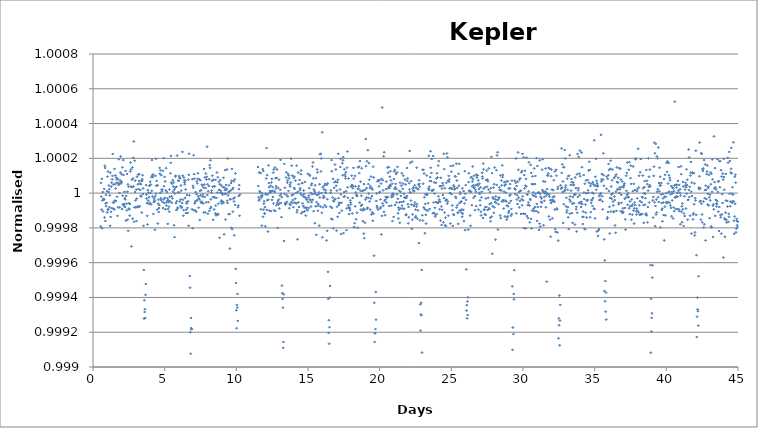
| Category | Series 0 |
|---|---|
| 0.5383740002289414 | 1 |
| 0.5588090000674129 | 1 |
| 0.5792430001311004 | 1 |
| 0.5996779999695718 | 1 |
| 0.6201120000332594 | 1 |
| 0.640546000096947 | 1 |
| 0.6609809999354184 | 1 |
| 0.6814149999991059 | 1 |
| 0.7018499998375773 | 1 |
| 0.7222839999012649 | 1 |
| 0.7427190002053976 | 1 |
| 0.7631529998034239 | 1 |
| 0.7835880001075566 | 1 |
| 0.8040220001712441 | 1 |
| 0.8244559997692704 | 1 |
| 0.8448910000734031 | 1 |
| 0.8653250001370907 | 1 |
| 0.8857599999755621 | 1 |
| 0.9061940000392497 | 1 |
| 0.9266289998777211 | 1 |
| 0.9470629999414086 | 1 |
| 0.9674970000050962 | 1 |
| 0.9879319998435676 | 1 |
| 1.0083659999072552 | 1 |
| 1.0288010002113879 | 1 |
| 1.0492349998094141 | 1 |
| 1.0696700001135468 | 1 |
| 1.0901040001772344 | 1 |
| 1.1105390000157058 | 1 |
| 1.1309730000793934 | 1 |
| 1.151407000143081 | 1 |
| 1.1718419999815524 | 1 |
| 1.19227600004524 | 1 |
| 1.2127109998837113 | 1 |
| 1.233144999947399 | 1 |
| 1.2535799997858703 | 1 |
| 1.2740139998495579 | 1 |
| 1.2944479999132454 | 1 |
| 1.3148830002173781 | 1 |
| 1.3353169998154044 | 1 |
| 1.3557520001195371 | 1 |
| 1.3761860001832247 | 1 |
| 1.396621000021696 | 1 |
| 1.4170550000853837 | 1 |
| 1.4374890001490712 | 1 |
| 1.4579239999875426 | 1 |
| 1.4783580000512302 | 1 |
| 1.4987929998897016 | 1 |
| 1.5192269999533892 | 1 |
| 1.5396610000170767 | 1 |
| 1.5600959998555481 | 1 |
| 1.5805299999192357 | 1 |
| 1.6009650002233684 | 1 |
| 1.6214000000618398 | 1 |
| 1.6418340001255274 | 1 |
| 1.662268000189215 | 1 |
| 1.6827030000276864 | 1 |
| 1.703137000091374 | 1 |
| 1.7235719999298453 | 1 |
| 1.744005999993533 | 1 |
| 1.7644409998320043 | 1 |
| 1.7848749998956919 | 1 |
| 1.8053089999593794 | 1 |
| 1.8257439997978508 | 1 |
| 1.8461779998615384 | 1 |
| 1.866613000165671 | 1 |
| 1.8870470002293587 | 1 |
| 1.90748200006783 | 1 |
| 1.9279160001315176 | 1 |
| 1.9483500001952052 | 1 |
| 1.9687850000336766 | 1 |
| 1.9892190000973642 | 1 |
| 2.0096539999358356 | 1 |
| 2.030088999774307 | 1 |
| 2.0505220000632107 | 1 |
| 2.070956999901682 | 1 |
| 2.0913909999653697 | 1 |
| 2.111825999803841 | 1 |
| 2.132261000107974 | 1 |
| 2.1526950001716614 | 1 |
| 2.1731289997696877 | 1 |
| 2.193562999833375 | 1 |
| 2.213998000137508 | 1 |
| 2.2344329999759793 | 1 |
| 2.254867000039667 | 1 |
| 2.2753019998781383 | 1 |
| 2.295735000167042 | 1 |
| 2.3161700000055134 | 1 |
| 2.336604000069201 | 1 |
| 2.3570389999076724 | 1 |
| 2.377474000211805 | 1 |
| 2.3979079998098314 | 1 |
| 2.418341999873519 | 1 |
| 2.4387759999372065 | 1 |
| 2.459210999775678 | 1 |
| 2.4796460000798106 | 1 |
| 2.500080000143498 | 1 |
| 2.5205149999819696 | 1 |
| 2.540949000045657 | 1 |
| 2.5613830001093447 | 1 |
| 2.581817999947816 | 1 |
| 2.6022520000115037 | 1 |
| 2.622686999849975 | 1 |
| 2.643122000154108 | 1 |
| 2.6635560002177954 | 1 |
| 2.6839899998158216 | 1 |
| 2.704423999879509 | 1 |
| 2.724859000183642 | 1 |
| 2.7452940000221133 | 1 |
| 2.765728000085801 | 1 |
| 2.7861629999242723 | 1 |
| 2.806596000213176 | 1 |
| 2.8270310000516474 | 1 |
| 2.847465000115335 | 1 |
| 2.8678999999538064 | 1 |
| 2.888334999792278 | 1 |
| 2.9087689998559654 | 1 |
| 2.929202999919653 | 1 |
| 2.9496369999833405 | 1 |
| 2.970071999821812 | 1 |
| 2.9905070001259446 | 1 |
| 3.010941000189632 | 1 |
| 3.0313760000281036 | 1 |
| 3.051810000091791 | 1 |
| 3.0722440001554787 | 1 |
| 3.09267899999395 | 1 |
| 3.1131130000576377 | 1 |
| 3.133547999896109 | 1 |
| 3.1539819999597967 | 1 |
| 3.1744160000234842 | 1 |
| 3.1948509998619556 | 1 |
| 3.215284999925643 | 1 |
| 3.235720000229776 | 1 |
| 3.2561550000682473 | 1 |
| 3.276589000131935 | 1 |
| 3.2970239999704063 | 1 |
| 3.3174569997936487 | 1 |
| 3.3378920000977814 | 1 |
| 3.358326000161469 | 1 |
| 3.3787609999999404 | 1 |
| 3.399195999838412 | 1 |
| 3.4196299999020994 | 1 |
| 3.440063999965787 | 1 |
| 3.4604980000294745 | 1 |
| 3.480932999867946 | 1 |
| 3.5013680001720786 | 1 |
| 3.521801999770105 | 1 |
| 3.5422370000742376 | 1 |
| 3.56266999989748 | 0.999 |
| 3.5831050002016127 | 0.999 |
| 3.603540000040084 | 0.999 |
| 3.6239740001037717 | 0.999 |
| 3.644408999942243 | 0.999 |
| 3.6648430000059307 | 0.999 |
| 3.6852770000696182 | 0.999 |
| 3.7057119999080896 | 1 |
| 3.726145999971777 | 1 |
| 3.7465809998102486 | 1 |
| 3.767014999873936 | 1 |
| 3.787450000178069 | 1 |
| 3.807883999776095 | 1 |
| 3.8283179998397827 | 1 |
| 3.8487530001439154 | 1 |
| 3.869187000207603 | 1 |
| 3.8896220000460744 | 1 |
| 3.910056999884546 | 1 |
| 3.9304900001734495 | 1 |
| 3.950925000011921 | 1 |
| 3.9713590000756085 | 1 |
| 3.99179399991408 | 1 |
| 4.0122279999777675 | 1 |
| 4.032662999816239 | 1 |
| 4.053098000120372 | 1 |
| 4.073530999943614 | 1 |
| 4.093965999782085 | 1 |
| 4.114401000086218 | 1 |
| 4.134835000149906 | 1 |
| 4.155269999988377 | 1 |
| 4.175704000052065 | 1 |
| 4.196138000115752 | 1 |
| 4.21657200017944 | 1 |
| 4.237007000017911 | 1 |
| 4.257441999856383 | 1 |
| 4.27787599992007 | 1 |
| 4.298311000224203 | 1 |
| 4.318744999822229 | 1 |
| 4.339178999885917 | 1 |
| 4.359614000190049 | 1 |
| 4.380047999788076 | 1 |
| 4.400483000092208 | 1 |
| 4.42091799993068 | 1 |
| 4.4413510002195835 | 1 |
| 4.461786000058055 | 1 |
| 4.4822200001217425 | 1 |
| 4.502654999960214 | 1 |
| 4.5230890000239015 | 1 |
| 4.543523999862373 | 1 |
| 4.56395799992606 | 1 |
| 4.584391999989748 | 1 |
| 4.604826999828219 | 1 |
| 4.625262000132352 | 1 |
| 4.64569600019604 | 1 |
| 4.666129999794066 | 1 |
| 4.6865639998577535 | 1 |
| 4.706999000161886 | 1 |
| 4.727434000000358 | 1 |
| 4.747868000064045 | 1 |
| 4.768302999902517 | 1 |
| 4.788736999966204 | 1 |
| 4.809171999804676 | 1 |
| 4.829605999868363 | 1 |
| 4.850039999932051 | 1 |
| 4.870474999770522 | 1 |
| 4.89090899983421 | 1 |
| 4.911344000138342 | 1 |
| 4.93177800020203 | 1 |
| 4.952211999800056 | 1 |
| 4.972647000104189 | 1 |
| 4.9930810001678765 | 1 |
| 5.013516000006348 | 1 |
| 5.0339500000700355 | 1 |
| 5.054384999908507 | 1 |
| 5.074818999972194 | 1 |
| 5.095253000035882 | 1 |
| 5.115687999874353 | 1 |
| 5.136121999938041 | 1 |
| 5.156556999776512 | 1 |
| 5.1769909998402 | 1 |
| 5.1974249999038875 | 1 |
| 5.21786000020802 | 1 |
| 5.238295000046492 | 1 |
| 5.258729000110179 | 1 |
| 5.279163000173867 | 1 |
| 5.299598000012338 | 1 |
| 5.320032000076026 | 1 |
| 5.340466999914497 | 1 |
| 5.360900999978185 | 1 |
| 5.381335000041872 | 1 |
| 5.401769999880344 | 1 |
| 5.422205000184476 | 1 |
| 5.442638000007719 | 1 |
| 5.46307299984619 | 1 |
| 5.483508000150323 | 1 |
| 5.5039420002140105 | 1 |
| 5.524377000052482 | 1 |
| 5.5448110001161695 | 1 |
| 5.565245000179857 | 1 |
| 5.585680000018328 | 1 |
| 5.606114000082016 | 1 |
| 5.6265480001457036 | 1 |
| 5.646982999984175 | 1 |
| 5.667417999822646 | 1 |
| 5.687853000126779 | 1 |
| 5.7082859999500215 | 1 |
| 5.728720999788493 | 1 |
| 5.7491549998521805 | 1 |
| 5.769590000156313 | 1 |
| 5.790024000220001 | 1 |
| 5.810459000058472 | 1 |
| 5.83089300012216 | 1 |
| 5.851327000185847 | 1 |
| 5.871762000024319 | 1 |
| 5.892196000088006 | 1 |
| 5.912630999926478 | 1 |
| 5.93306600023061 | 1 |
| 5.953499000053853 | 1 |
| 5.973933999892324 | 1 |
| 5.994367999956012 | 1 |
| 6.014802999794483 | 1 |
| 6.035238000098616 | 1 |
| 6.0556720001623034 | 1 |
| 6.076106000225991 | 1 |
| 6.096541000064462 | 1 |
| 6.11697500012815 | 1 |
| 6.137409999966621 | 1 |
| 6.157844000030309 | 1 |
| 6.17827899986878 | 1 |
| 6.198712999932468 | 1 |
| 6.2191469999961555 | 1 |
| 6.239581999834627 | 1 |
| 6.2600159998983145 | 1 |
| 6.280451000202447 | 1 |
| 6.3008849998004735 | 1 |
| 6.321318999864161 | 1 |
| 6.341754000168294 | 1 |
| 6.362188000231981 | 1 |
| 6.382623000070453 | 1 |
| 6.40305700013414 | 1 |
| 6.423491999972612 | 1 |
| 6.443926999811083 | 1 |
| 6.464360000099987 | 1 |
| 6.484794999938458 | 1 |
| 6.505229000002146 | 1 |
| 6.525663999840617 | 1 |
| 6.546097999904305 | 1 |
| 6.566533000208437 | 1 |
| 6.586966999806464 | 1 |
| 6.607402000110596 | 1 |
| 6.627836000174284 | 1 |
| 6.64826999977231 | 1 |
| 6.668705000076443 | 1 |
| 6.689139999914914 | 1 |
| 6.709573999978602 | 1 |
| 6.7300080000422895 | 1 |
| 6.750442000105977 | 1 |
| 6.7708769999444485 | 0.999 |
| 6.79131199978292 | 0.999 |
| 6.8117459998466074 | 0.999 |
| 6.832179999910295 | 0.999 |
| 6.852615000214428 | 0.999 |
| 6.873048999812454 | 0.999 |
| 6.893484000116587 | 0.999 |
| 6.913918000180274 | 1 |
| 6.934353000018746 | 1 |
| 6.954787000082433 | 1 |
| 6.975221000146121 | 1 |
| 6.995655999984592 | 1 |
| 7.01609000004828 | 1 |
| 7.036524999886751 | 1 |
| 7.056960000190884 | 1 |
| 7.077393000014126 | 1 |
| 7.097827999852598 | 1 |
| 7.118261999916285 | 1 |
| 7.138697000220418 | 1 |
| 7.159132000058889 | 1 |
| 7.179566000122577 | 1 |
| 7.200000999961048 | 1 |
| 7.220435000024736 | 1 |
| 7.2408690000884235 | 1 |
| 7.261303000152111 | 1 |
| 7.2817379999905825 | 1 |
| 7.302172999829054 | 1 |
| 7.322606999892741 | 1 |
| 7.343040999956429 | 1 |
| 7.363475000020117 | 1 |
| 7.383909999858588 | 1 |
| 7.404345000162721 | 1 |
| 7.424779000226408 | 1 |
| 7.44521400006488 | 1 |
| 7.465648000128567 | 1 |
| 7.486082000192255 | 1 |
| 7.506517000030726 | 1 |
| 7.526951000094414 | 1 |
| 7.547385999932885 | 1 |
| 7.567820999771357 | 1 |
| 7.58825400006026 | 1 |
| 7.608688000123948 | 1 |
| 7.629122999962419 | 1 |
| 7.649557999800891 | 1 |
| 7.669993000105023 | 1 |
| 7.690427000168711 | 1 |
| 7.7108610002323985 | 1 |
| 7.731294999830425 | 1 |
| 7.7517300001345575 | 1 |
| 7.772164000198245 | 1 |
| 7.7925990000367165 | 1 |
| 7.813033999875188 | 1 |
| 7.833467000164092 | 1 |
| 7.853902000002563 | 1 |
| 7.874336000066251 | 1 |
| 7.894770999904722 | 1 |
| 7.915206000208855 | 1 |
| 7.935639999806881 | 1 |
| 7.956075000111014 | 1 |
| 7.976507999934256 | 1 |
| 7.9969429997727275 | 1 |
| 8.01737800007686 | 1 |
| 8.037812000140548 | 1 |
| 8.05824699997902 | 1 |
| 8.07868199981749 | 1 |
| 8.099115000106394 | 1 |
| 8.119549000170082 | 1 |
| 8.139984000008553 | 1 |
| 8.160418999847025 | 1 |
| 8.180852999910712 | 1 |
| 8.201288000214845 | 1 |
| 8.221721999812871 | 1 |
| 8.242155999876559 | 1 |
| 8.262591000180691 | 1 |
| 8.283024999778718 | 1 |
| 8.30346000008285 | 1 |
| 8.323894999921322 | 1 |
| 8.344328000210226 | 1 |
| 8.364763000048697 | 1 |
| 8.385197000112385 | 1 |
| 8.405631999950856 | 1 |
| 8.426066999789327 | 1 |
| 8.446500999853015 | 1 |
| 8.466934999916703 | 1 |
| 8.48736899998039 | 1 |
| 8.507803999818861 | 1 |
| 8.528239000122994 | 1 |
| 8.548673000186682 | 1 |
| 8.569108000025153 | 1 |
| 8.58954200008884 | 1 |
| 8.609976000152528 | 1 |
| 8.630410000216216 | 1 |
| 8.650845000054687 | 1 |
| 8.671279999893159 | 1 |
| 8.691715000197291 | 1 |
| 8.712148999795318 | 1 |
| 8.732582000084221 | 1 |
| 8.753016999922693 | 1 |
| 8.77345099998638 | 1 |
| 8.793887000065297 | 1 |
| 8.814321000128984 | 1 |
| 8.834755999967456 | 1 |
| 8.855188999790698 | 1 |
| 8.875622999854386 | 1 |
| 8.896058999933302 | 1 |
| 8.91649299999699 | 1 |
| 8.936927999835461 | 1 |
| 8.957361999899149 | 1 |
| 8.977795000188053 | 1 |
| 8.998230000026524 | 1 |
| 9.018664999864995 | 1 |
| 9.039100000169128 | 1 |
| 9.059534000232816 | 1 |
| 9.079969000071287 | 1 |
| 9.10040199989453 | 1 |
| 9.120837000198662 | 1 |
| 9.141272000037134 | 1 |
| 9.161706000100821 | 1 |
| 9.182140999939293 | 1 |
| 9.20257500000298 | 1 |
| 9.223007999826223 | 1 |
| 9.24344399990514 | 1 |
| 9.263877999968827 | 1 |
| 9.284312999807298 | 1 |
| 9.304746999870986 | 1 |
| 9.325182000175118 | 1 |
| 9.34561499999836 | 1 |
| 9.366049999836832 | 1 |
| 9.386485000140965 | 1 |
| 9.406919000204653 | 1 |
| 9.427354000043124 | 1 |
| 9.447788000106812 | 1 |
| 9.468222999945283 | 1 |
| 9.48865700000897 | 1 |
| 9.509091000072658 | 1 |
| 9.52952599991113 | 1 |
| 9.549959999974817 | 1 |
| 9.570394999813288 | 1 |
| 9.590830000117421 | 1 |
| 9.611262999940664 | 1 |
| 9.631697999779135 | 1 |
| 9.652131999842823 | 1 |
| 9.672567000146955 | 1 |
| 9.693001999985427 | 1 |
| 9.713436000049114 | 1 |
| 9.733870000112802 | 1 |
| 9.75430400017649 | 1 |
| 9.77473900001496 | 1 |
| 9.795173999853432 | 1 |
| 9.815609000157565 | 1 |
| 9.836043000221252 | 1 |
| 9.856476000044495 | 1 |
| 9.876910999882966 | 1 |
| 9.897344999946654 | 1 |
| 9.91778100002557 | 1 |
| 9.938215000089258 | 1 |
| 9.958649000152946 | 1 |
| 9.979083000216633 | 0.999 |
| 9.99951699981466 | 0.999 |
| 10.019952000118792 | 0.999 |
| 10.040386999957263 | 0.999 |
| 10.060821999795735 | 0.999 |
| 10.081255999859422 | 0.999 |
| 10.101689000148326 | 0.999 |
| 10.122123999986798 | 1 |
| 10.142558000050485 | 1 |
| 10.162994000129402 | 1 |
| 10.18342800019309 | 1 |
| 10.20386300003156 | 1 |
| 10.224297000095248 | 1 |
| 10.24472999991849 | 1 |
| 11.511665999889374 | 1 |
| 11.532099999953061 | 1 |
| 11.552534999791533 | 1 |
| 11.57296899985522 | 1 |
| 11.593404000159353 | 1 |
| 11.61383800022304 | 1 |
| 11.634271999821067 | 1 |
| 11.6547070001252 | 1 |
| 11.675141000188887 | 1 |
| 11.695576000027359 | 1 |
| 11.716010000091046 | 1 |
| 11.736444999929518 | 1 |
| 11.756878999993205 | 1 |
| 11.777313000056893 | 1 |
| 11.797747999895364 | 1 |
| 11.818181999959052 | 1 |
| 11.838616999797523 | 1 |
| 11.85905099986121 | 1 |
| 11.879486000165343 | 1 |
| 11.89992000022903 | 1 |
| 11.920355000067502 | 1 |
| 11.94078900013119 | 1 |
| 11.961223000194877 | 1 |
| 11.981658000033349 | 1 |
| 12.002092000097036 | 1 |
| 12.022526999935508 | 1 |
| 12.042960999999195 | 1 |
| 12.063395999837667 | 1 |
| 12.083829999901354 | 1 |
| 12.104263999965042 | 1 |
| 12.124698999803513 | 1 |
| 12.1451329998672 | 1 |
| 12.165568000171334 | 1 |
| 12.18600199976936 | 1 |
| 12.206437000073493 | 1 |
| 12.22687100013718 | 1 |
| 12.247305000200868 | 1 |
| 12.267740000039339 | 1 |
| 12.288174000103027 | 1 |
| 12.308608999941498 | 1 |
| 12.329043000005186 | 1 |
| 12.349477999843657 | 1 |
| 12.369911999907345 | 1 |
| 12.390345999971032 | 1 |
| 12.410780999809504 | 1 |
| 12.431214999873191 | 1 |
| 12.451650000177324 | 1 |
| 12.47208399977535 | 1 |
| 12.492519000079483 | 1 |
| 12.51295300014317 | 1 |
| 12.533387000206858 | 1 |
| 12.55382200004533 | 1 |
| 12.574256000109017 | 1 |
| 12.594690999947488 | 1 |
| 12.615125000011176 | 1 |
| 12.635559999849647 | 1 |
| 12.655993999913335 | 1 |
| 12.676429000217468 | 1 |
| 12.696862999815494 | 1 |
| 12.717296999879181 | 1 |
| 12.737732000183314 | 1 |
| 12.75816599978134 | 1 |
| 12.778601000085473 | 1 |
| 12.79903500014916 | 1 |
| 12.819469999987632 | 1 |
| 12.83990400005132 | 1 |
| 12.860338000115007 | 1 |
| 12.880772999953479 | 1 |
| 12.901207000017166 | 1 |
| 12.921641999855638 | 1 |
| 12.942075999919325 | 1 |
| 12.962511000223458 | 1 |
| 12.982944999821484 | 1 |
| 13.003380000125617 | 1 |
| 13.023814000189304 | 1 |
| 13.04424799978733 | 1 |
| 13.064683000091463 | 1 |
| 13.085117000155151 | 1 |
| 13.105551999993622 | 1 |
| 13.12598600005731 | 1 |
| 13.146420999895781 | 1 |
| 13.166854999959469 | 1 |
| 13.187289000023156 | 0.999 |
| 13.207723999861628 | 0.999 |
| 13.228157999925315 | 0.999 |
| 13.248593000229448 | 0.999 |
| 13.269026999827474 | 0.999 |
| 13.289462000131607 | 0.999 |
| 13.309896000195295 | 0.999 |
| 13.330329999793321 | 1 |
| 13.350765000097454 | 1 |
| 13.371199000161141 | 1 |
| 13.391633999999613 | 1 |
| 13.4120680000633 | 1 |
| 13.432502999901772 | 1 |
| 13.452936999965459 | 1 |
| 13.473371000029147 | 1 |
| 13.493805999867618 | 1 |
| 13.514239999931306 | 1 |
| 13.534674999769777 | 1 |
| 13.555108999833465 | 1 |
| 13.575544000137597 | 1 |
| 13.595978000201285 | 1 |
| 13.616413000039756 | 1 |
| 13.636847000103444 | 1 |
| 13.657281999941915 | 1 |
| 13.677716000005603 | 1 |
| 13.69815000006929 | 1 |
| 13.718584999907762 | 1 |
| 13.73901899997145 | 1 |
| 13.75945399980992 | 1 |
| 13.779887999873608 | 1 |
| 13.800321999937296 | 1 |
| 13.820756999775767 | 1 |
| 13.841190999839455 | 1 |
| 13.861626000143588 | 1 |
| 13.882060000207275 | 1 |
| 13.902495000045747 | 1 |
| 13.922929000109434 | 1 |
| 13.943363999947906 | 1 |
| 13.963798000011593 | 1 |
| 13.98423200007528 | 1 |
| 14.004666999913752 | 1 |
| 14.02510099997744 | 1 |
| 14.045535999815911 | 1 |
| 14.065969999879599 | 1 |
| 14.086405000183731 | 1 |
| 14.106838999781758 | 1 |
| 14.127272999845445 | 1 |
| 14.147708000149578 | 1 |
| 14.168142000213265 | 1 |
| 14.188577000051737 | 1 |
| 14.209011000115424 | 1 |
| 14.229445999953896 | 1 |
| 14.249880000017583 | 1 |
| 14.270314000081271 | 1 |
| 14.290748999919742 | 1 |
| 14.31118299998343 | 1 |
| 14.331617999821901 | 1 |
| 14.352051999885589 | 1 |
| 14.372487000189722 | 1 |
| 14.41335600009188 | 1 |
| 14.433790000155568 | 1 |
| 14.454224000219256 | 1 |
| 14.474659000057727 | 1 |
| 14.495093000121415 | 1 |
| 14.515527999959886 | 1 |
| 14.535962000023574 | 1 |
| 14.556396000087261 | 1 |
| 14.576830999925733 | 1 |
| 14.59726499998942 | 1 |
| 14.617699999827892 | 1 |
| 14.63813399989158 | 1 |
| 14.658569000195712 | 1 |
| 14.679002999793738 | 1 |
| 14.69943800009787 | 1 |
| 14.719872000161558 | 1 |
| 14.74030700000003 | 1 |
| 14.760741000063717 | 1 |
| 14.781175000127405 | 1 |
| 14.801609999965876 | 1 |
| 14.822044000029564 | 1 |
| 14.842478999868035 | 1 |
| 14.862912999931723 | 1 |
| 14.883347999770194 | 1 |
| 14.903781999833882 | 1 |
| 14.92421599989757 | 1 |
| 14.944651000201702 | 1 |
| 14.965084999799728 | 1 |
| 14.985520000103861 | 1 |
| 15.005954000167549 | 1 |
| 15.02638900000602 | 1 |
| 15.046823000069708 | 1 |
| 15.067257000133395 | 1 |
| 15.087691999971867 | 1 |
| 15.108126000035554 | 1 |
| 15.128560999874026 | 1 |
| 15.148994999937713 | 1 |
| 15.169429999776185 | 1 |
| 15.189863999839872 | 1 |
| 15.21029799990356 | 1 |
| 15.230733000207692 | 1 |
| 15.251166999805719 | 1 |
| 15.271602000109851 | 1 |
| 15.292036000173539 | 1 |
| 15.31247100001201 | 1 |
| 15.332905000075698 | 1 |
| 15.353339000139385 | 1 |
| 15.373773999977857 | 1 |
| 15.394208000041544 | 1 |
| 15.414642999880016 | 1 |
| 15.435076999943703 | 1 |
| 15.455511999782175 | 1 |
| 15.475945999845862 | 1 |
| 15.496381000149995 | 1 |
| 15.516815000213683 | 1 |
| 15.537248999811709 | 1 |
| 15.557684000115842 | 1 |
| 15.57811800017953 | 1 |
| 15.598553000018 | 1 |
| 15.618987000081688 | 1 |
| 15.63942199992016 | 1 |
| 15.659855999983847 | 1 |
| 15.680290999822319 | 1 |
| 15.700724999886006 | 1 |
| 15.721158999949694 | 1 |
| 15.741593999788165 | 1 |
| 15.762027999851853 | 1 |
| 15.782463000155985 | 1 |
| 15.802897000219673 | 1 |
| 15.823332000058144 | 1 |
| 15.843766000121832 | 1 |
| 15.86420000018552 | 1 |
| 15.88463500002399 | 1 |
| 15.905069000087678 | 1 |
| 15.92550399992615 | 1 |
| 15.945937999989837 | 1 |
| 15.966372999828309 | 1 |
| 15.986806999891996 | 1 |
| 16.007240999955684 | 1 |
| 16.027675999794155 | 1 |
| 16.048109999857843 | 1 |
| 16.068545000161976 | 1 |
| 16.088979000225663 | 1 |
| 16.109414000064135 | 1 |
| 16.129848000127822 | 1 |
| 16.15028200019151 | 1 |
| 16.17071700002998 | 1 |
| 16.19115100009367 | 1 |
| 16.21158599993214 | 1 |
| 16.232019999995828 | 1 |
| 16.2524549998343 | 1 |
| 16.272888999897987 | 1 |
| 16.293322999961674 | 1 |
| 16.313757999800146 | 1 |
| 16.334191999863833 | 1 |
| 16.354627000167966 | 1 |
| 16.375061000231653 | 1 |
| 16.395496000070125 | 1 |
| 16.415930000133812 | 0.999 |
| 16.436364999972284 | 0.999 |
| 16.45679900003597 | 0.999 |
| 16.47723300009966 | 0.999 |
| 16.49766799993813 | 0.999 |
| 16.518102000001818 | 0.999 |
| 16.53853699984029 | 0.999 |
| 16.558970999903977 | 1 |
| 16.57940600020811 | 1 |
| 16.599839999806136 | 1 |
| 16.620273999869823 | 1 |
| 16.640709000173956 | 1 |
| 16.661142999771982 | 1 |
| 16.681578000076115 | 1 |
| 16.702012000139803 | 1 |
| 16.722446999978274 | 1 |
| 16.74288100004196 | 1 |
| 16.763315999880433 | 1 |
| 16.78374999994412 | 1 |
| 16.804184000007808 | 1 |
| 16.82461899984628 | 1 |
| 16.845052999909967 | 1 |
| 16.8654880002141 | 1 |
| 16.885921999812126 | 1 |
| 16.90635700011626 | 1 |
| 16.926791000179946 | 1 |
| 16.947224999777973 | 1 |
| 16.967660000082105 | 1 |
| 16.988094000145793 | 1 |
| 17.008528999984264 | 1 |
| 17.028963000047952 | 1 |
| 17.049397999886423 | 1 |
| 17.06983199995011 | 1 |
| 17.0902660000138 | 1 |
| 17.11070099985227 | 1 |
| 17.131134999915957 | 1 |
| 17.15157000022009 | 1 |
| 17.172003999818116 | 1 |
| 17.19243900012225 | 1 |
| 17.212873000185937 | 1 |
| 17.233308000024408 | 1 |
| 17.253742000088096 | 1 |
| 17.274176000151783 | 1 |
| 17.294610999990255 | 1 |
| 17.315045000053942 | 1 |
| 17.335479999892414 | 1 |
| 17.3559139999561 | 1 |
| 17.39678299985826 | 1 |
| 17.417216999921948 | 1 |
| 17.43765200022608 | 1 |
| 17.458085999824107 | 1 |
| 17.47852100012824 | 1 |
| 17.498955000191927 | 1 |
| 17.5193900000304 | 1 |
| 17.539824000094086 | 1 |
| 17.560258999932557 | 1 |
| 17.580692999996245 | 1 |
| 17.601127000059932 | 1 |
| 17.621561999898404 | 1 |
| 17.64199599996209 | 1 |
| 17.662430999800563 | 1 |
| 17.68286499986425 | 1 |
| 17.703300000168383 | 1 |
| 17.72373400023207 | 1 |
| 17.744167999830097 | 1 |
| 17.76460300013423 | 1 |
| 17.785037000197917 | 1 |
| 17.80547200003639 | 1 |
| 17.825906000100076 | 1 |
| 17.846340999938548 | 1 |
| 17.866775000002235 | 1 |
| 17.887209000065923 | 1 |
| 17.907643999904394 | 1 |
| 17.92807799996808 | 1 |
| 17.948512999806553 | 1 |
| 17.96894699987024 | 1 |
| 17.989382000174373 | 1 |
| 18.0098159997724 | 1 |
| 18.030249999836087 | 1 |
| 18.05068500014022 | 1 |
| 18.071119000203907 | 1 |
| 18.09155400004238 | 1 |
| 18.111988000106066 | 1 |
| 18.132422999944538 | 1 |
| 18.152857000008225 | 1 |
| 18.173291000071913 | 1 |
| 18.193725999910384 | 1 |
| 18.214159999974072 | 1 |
| 18.234594999812543 | 1 |
| 18.25502899987623 | 1 |
| 18.275464000180364 | 1 |
| 18.29589799977839 | 1 |
| 18.316333000082523 | 1 |
| 18.33676700014621 | 1 |
| 18.35720199998468 | 1 |
| 18.37763600004837 | 1 |
| 18.398070000112057 | 1 |
| 18.418504999950528 | 1 |
| 18.438939000014216 | 1 |
| 18.459373999852687 | 1 |
| 18.479807999916375 | 1 |
| 18.500243000220507 | 1 |
| 18.520676999818534 | 1 |
| 18.54111099988222 | 1 |
| 18.561546000186354 | 1 |
| 18.58197999978438 | 1 |
| 18.602415000088513 | 1 |
| 18.6228490001522 | 1 |
| 18.643283999990672 | 1 |
| 18.66371800005436 | 1 |
| 18.684152000118047 | 1 |
| 18.70458699995652 | 1 |
| 18.725021000020206 | 1 |
| 18.745455999858677 | 1 |
| 18.765889999922365 | 1 |
| 18.786325000226498 | 1 |
| 18.806758999824524 | 1 |
| 18.82719299988821 | 1 |
| 18.847628000192344 | 1 |
| 18.86806199979037 | 1 |
| 18.888497000094503 | 1 |
| 18.90893100015819 | 1 |
| 18.929365999996662 | 1 |
| 18.94980000006035 | 1 |
| 18.970234000124037 | 1 |
| 18.99066899996251 | 1 |
| 19.011103000026196 | 1 |
| 19.031537999864668 | 1 |
| 19.051971999928355 | 1 |
| 19.072407000232488 | 1 |
| 19.092840999830514 | 1 |
| 19.113276000134647 | 1 |
| 19.133710000198334 | 1 |
| 19.15414399979636 | 1 |
| 19.174579000100493 | 1 |
| 19.19501300016418 | 1 |
| 19.215448000002652 | 1 |
| 19.23588200006634 | 1 |
| 19.25631699990481 | 1 |
| 19.2767509999685 | 1 |
| 19.297185000032187 | 1 |
| 19.317619999870658 | 1 |
| 19.338053999934345 | 1 |
| 19.358488999772817 | 1 |
| 19.378922999836504 | 1 |
| 19.399358000140637 | 1 |
| 19.419792000204325 | 1 |
| 19.440227000042796 | 1 |
| 19.460661000106484 | 1 |
| 19.48109500017017 | 1 |
| 19.501530000008643 | 1 |
| 19.52196400007233 | 1 |
| 19.5423989999108 | 1 |
| 19.56283299997449 | 1 |
| 19.58326799981296 | 1 |
| 19.603701999876648 | 1 |
| 19.624135999940336 | 0.999 |
| 19.644570999778807 | 0.999 |
| 19.665004999842495 | 0.999 |
| 19.685440000146627 | 0.999 |
| 19.705874000210315 | 0.999 |
| 19.726309000048786 | 0.999 |
| 19.746743000112474 | 0.999 |
| 19.76717700017616 | 1 |
| 19.787612000014633 | 1 |
| 19.80804600007832 | 1 |
| 19.828480999916792 | 1 |
| 19.84891499998048 | 1 |
| 19.86934999981895 | 1 |
| 19.88978399988264 | 1 |
| 19.910217999946326 | 1 |
| 19.930652999784797 | 1 |
| 19.951086999848485 | 1 |
| 19.971522000152618 | 1 |
| 19.991956000216305 | 1 |
| 20.012391000054777 | 1 |
| 20.032825000118464 | 1 |
| 20.053259999956936 | 1 |
| 20.073694000020623 | 1 |
| 20.09412800008431 | 1 |
| 20.114562999922782 | 1 |
| 20.13499699998647 | 1 |
| 20.15543199982494 | 1 |
| 20.17586599988863 | 1 |
| 20.19630100019276 | 1 |
| 20.216734999790788 | 1 |
| 20.237168999854475 | 1 |
| 20.257604000158608 | 1 |
| 20.278038000222296 | 1 |
| 20.298473000060767 | 1 |
| 20.318907000124454 | 1 |
| 20.339341999962926 | 1 |
| 20.3802100000903 | 1 |
| 20.400644999928772 | 1 |
| 20.42107899999246 | 1 |
| 20.44151399983093 | 1 |
| 20.46194799989462 | 1 |
| 20.48238300019875 | 1 |
| 20.502816999796778 | 1 |
| 20.523250999860466 | 1 |
| 20.5436860001646 | 1 |
| 20.564120000228286 | 1 |
| 20.584555000066757 | 1 |
| 20.604989000130445 | 1 |
| 20.625423999968916 | 1 |
| 20.645858000032604 | 1 |
| 20.66629200009629 | 1 |
| 20.686726999934763 | 1 |
| 20.70716099999845 | 1 |
| 20.72759599983692 | 1 |
| 20.74802999990061 | 1 |
| 20.768465000204742 | 1 |
| 20.78889899980277 | 1 |
| 20.8093340001069 | 1 |
| 20.82976800017059 | 1 |
| 20.85020300000906 | 1 |
| 20.870637000072747 | 1 |
| 20.891071000136435 | 1 |
| 20.911505999974906 | 1 |
| 20.931940000038594 | 1 |
| 20.952374999877065 | 1 |
| 20.972808999940753 | 1 |
| 20.99324300000444 | 1 |
| 21.013677999842912 | 1 |
| 21.0341119999066 | 1 |
| 21.054547000210732 | 1 |
| 21.07498099980876 | 1 |
| 21.09541600011289 | 1 |
| 21.11585000017658 | 1 |
| 21.13628500001505 | 1 |
| 21.156719000078738 | 1 |
| 21.177153000142425 | 1 |
| 21.197587999980897 | 1 |
| 21.218022000044584 | 1 |
| 21.238456999883056 | 1 |
| 21.258890999946743 | 1 |
| 21.279325999785215 | 1 |
| 21.299759999848902 | 1 |
| 21.32019399991259 | 1 |
| 21.340629000216722 | 1 |
| 21.36106299981475 | 1 |
| 21.38149800011888 | 1 |
| 21.40193200018257 | 1 |
| 21.42236700002104 | 1 |
| 21.442801000084728 | 1 |
| 21.463235000148416 | 1 |
| 21.483669999986887 | 1 |
| 21.504104000050575 | 1 |
| 21.524538999889046 | 1 |
| 21.544972999952734 | 1 |
| 21.565407999791205 | 1 |
| 21.585841999854892 | 1 |
| 21.606277000159025 | 1 |
| 21.626711000222713 | 1 |
| 21.64714499982074 | 1 |
| 21.66758000012487 | 1 |
| 21.68801400018856 | 1 |
| 21.70844900002703 | 1 |
| 21.72888300009072 | 1 |
| 21.74931799992919 | 1 |
| 21.769751999992877 | 1 |
| 21.790186000056565 | 1 |
| 21.810620999895036 | 1 |
| 21.831054999958724 | 1 |
| 21.851489999797195 | 1 |
| 21.871923999860883 | 1 |
| 21.892359000165015 | 1 |
| 21.912793000228703 | 1 |
| 21.933228000067174 | 1 |
| 21.953662000130862 | 1 |
| 21.97409600019455 | 1 |
| 21.99453100003302 | 1 |
| 22.01496500009671 | 1 |
| 22.03539999993518 | 1 |
| 22.055833999998868 | 1 |
| 22.07626899983734 | 1 |
| 22.096702999901026 | 1 |
| 22.117136999964714 | 1 |
| 22.137571999803185 | 1 |
| 22.158005999866873 | 1 |
| 22.178441000171006 | 1 |
| 22.198874999769032 | 1 |
| 22.219310000073165 | 1 |
| 22.239744000136852 | 1 |
| 22.26017800020054 | 1 |
| 22.28061300003901 | 1 |
| 22.3010470001027 | 1 |
| 22.32148199994117 | 1 |
| 22.341916000004858 | 1 |
| 22.36235099984333 | 1 |
| 22.382784999907017 | 1 |
| 22.403218999970704 | 1 |
| 22.423653999809176 | 1 |
| 22.444087999872863 | 1 |
| 22.464523000176996 | 1 |
| 22.484956999775022 | 1 |
| 22.505392000079155 | 1 |
| 22.525826000142843 | 1 |
| 22.546260999981314 | 1 |
| 22.566695000045 | 1 |
| 22.58712900010869 | 1 |
| 22.60756399994716 | 1 |
| 22.627998000010848 | 1 |
| 22.64843299984932 | 1 |
| 22.668866999913007 | 1 |
| 22.68930200021714 | 1 |
| 22.709735999815166 | 1 |
| 22.730169999878854 | 1 |
| 22.750605000182986 | 1 |
| 22.771038999781013 | 1 |
| 22.791474000085145 | 1 |
| 22.811908000148833 | 1 |
| 22.832342999987304 | 0.999 |
| 22.85277700005099 | 0.999 |
| 22.873211999889463 | 0.999 |
| 22.89364599995315 | 0.999 |
| 22.91408000001684 | 0.999 |
| 22.93451499985531 | 1 |
| 22.954948999918997 | 0.999 |
| 22.97538400022313 | 1 |
| 22.995817999821156 | 1 |
| 23.01625300012529 | 1 |
| 23.036687000188977 | 1 |
| 23.057120999787003 | 1 |
| 23.077556000091136 | 1 |
| 23.097990000154823 | 1 |
| 23.118424999993294 | 1 |
| 23.138859000056982 | 1 |
| 23.159293999895453 | 1 |
| 23.17972799995914 | 1 |
| 23.20016200002283 | 1 |
| 23.2205969998613 | 1 |
| 23.241030999924988 | 1 |
| 23.26146600022912 | 1 |
| 23.281899999827147 | 1 |
| 23.30233500013128 | 1 |
| 23.322769000194967 | 1 |
| 23.363638000097126 | 1 |
| 23.384072000160813 | 1 |
| 23.404506999999285 | 1 |
| 23.424941000062972 | 1 |
| 23.445375999901444 | 1 |
| 23.46580999996513 | 1 |
| 23.48624400002882 | 1 |
| 23.50667899986729 | 1 |
| 23.527112999930978 | 1 |
| 23.54754799976945 | 1 |
| 23.567981999833137 | 1 |
| 23.58841700013727 | 1 |
| 23.608851000200957 | 1 |
| 23.62928600003943 | 1 |
| 23.649720000103116 | 1 |
| 23.670154999941587 | 1 |
| 23.690589000005275 | 1 |
| 23.711023000068963 | 1 |
| 23.731457999907434 | 1 |
| 23.75189199997112 | 1 |
| 23.772326999809593 | 1 |
| 23.79276099987328 | 1 |
| 23.813194999936968 | 1 |
| 23.83362999977544 | 1 |
| 23.854063999839127 | 1 |
| 23.87449900014326 | 1 |
| 23.894933000206947 | 1 |
| 23.91536800004542 | 1 |
| 23.935802000109106 | 1 |
| 23.956236999947578 | 1 |
| 23.976671000011265 | 1 |
| 23.997105000074953 | 1 |
| 24.017539999913424 | 1 |
| 24.037973999977112 | 1 |
| 24.058408999815583 | 1 |
| 24.07884299987927 | 1 |
| 24.099278000183403 | 1 |
| 24.11971199978143 | 1 |
| 24.140145999845117 | 1 |
| 24.16058100014925 | 1 |
| 24.181015000212938 | 1 |
| 24.20145000005141 | 1 |
| 24.221884000115097 | 1 |
| 24.242318999953568 | 1 |
| 24.262753000017256 | 1 |
| 24.283187000080943 | 1 |
| 24.303621999919415 | 1 |
| 24.324055999983102 | 1 |
| 24.344490999821573 | 1 |
| 24.36492499988526 | 1 |
| 24.385360000189394 | 1 |
| 24.40579399978742 | 1 |
| 24.426229000091553 | 1 |
| 24.44666300015524 | 1 |
| 24.467097000218928 | 1 |
| 24.4875320000574 | 1 |
| 24.507966000121087 | 1 |
| 24.52840099995956 | 1 |
| 24.548835000023246 | 1 |
| 24.569269999861717 | 1 |
| 24.589703999925405 | 1 |
| 24.610137999989092 | 1 |
| 24.630572999827564 | 1 |
| 24.65100699989125 | 1 |
| 24.671442000195384 | 1 |
| 24.69187599979341 | 1 |
| 24.712311000097543 | 1 |
| 24.73274500016123 | 1 |
| 24.753179999999702 | 1 |
| 24.77361400006339 | 1 |
| 24.794048000127077 | 1 |
| 24.81448299996555 | 1 |
| 24.834917000029236 | 1 |
| 24.855351999867707 | 1 |
| 24.875785999931395 | 1 |
| 24.896219999995083 | 1 |
| 24.916654999833554 | 1 |
| 24.93708899989724 | 1 |
| 24.957524000201374 | 1 |
| 24.9779579997994 | 1 |
| 24.998393000103533 | 1 |
| 25.01882700016722 | 1 |
| 25.039262000005692 | 1 |
| 25.05969600006938 | 1 |
| 25.080130000133067 | 1 |
| 25.10056499997154 | 1 |
| 25.120999000035226 | 1 |
| 25.141433999873698 | 1 |
| 25.161867999937385 | 1 |
| 25.182302999775857 | 1 |
| 25.202736999839544 | 1 |
| 25.223172000143677 | 1 |
| 25.243606000207365 | 1 |
| 25.26403999980539 | 1 |
| 25.284475000109524 | 1 |
| 25.30490900017321 | 1 |
| 25.325344000011683 | 1 |
| 25.34577800007537 | 1 |
| 25.36621299991384 | 1 |
| 25.38664699997753 | 1 |
| 25.407081000041217 | 1 |
| 25.427515999879688 | 1 |
| 25.447949999943376 | 1 |
| 25.468384999781847 | 1 |
| 25.488818999845535 | 1 |
| 25.509254000149667 | 1 |
| 25.529688000213355 | 1 |
| 25.55012199981138 | 1 |
| 25.570557000115514 | 1 |
| 25.5909910001792 | 1 |
| 25.611426000017673 | 1 |
| 25.63186000008136 | 1 |
| 25.65229499991983 | 1 |
| 25.67272899998352 | 1 |
| 25.693163000047207 | 1 |
| 25.71359799988568 | 1 |
| 25.734031999949366 | 1 |
| 25.754466999787837 | 1 |
| 25.774900999851525 | 1 |
| 25.795336000155658 | 1 |
| 25.815770000219345 | 1 |
| 25.83620399981737 | 1 |
| 25.856639000121504 | 1 |
| 25.87707300018519 | 1 |
| 25.897508000023663 | 1 |
| 25.91794200008735 | 1 |
| 25.938376999925822 | 1 |
| 25.95881099998951 | 1 |
| 25.979245000053197 | 1 |
| 25.99967999989167 | 1 |
| 26.020113999955356 | 1 |
| 26.040548999793828 | 1 |
| 26.060982999857515 | 0.999 |
| 26.081418000161648 | 0.999 |
| 26.101852000225335 | 0.999 |
| 26.122287000063807 | 0.999 |
| 26.142721000127494 | 0.999 |
| 26.163155000191182 | 0.999 |
| 26.183590000029653 | 1 |
| 26.20402400009334 | 1 |
| 26.224458999931812 | 1 |
| 26.2448929999955 | 1 |
| 26.26532799983397 | 1 |
| 26.28576199989766 | 1 |
| 26.30619700020179 | 1 |
| 26.347064999863505 | 1 |
| 26.367500000167638 | 1 |
| 26.387934000231326 | 1 |
| 26.408369000069797 | 1 |
| 26.428803000133485 | 1 |
| 26.449237999971956 | 1 |
| 26.469672000035644 | 1 |
| 26.49010600009933 | 1 |
| 26.510540999937803 | 1 |
| 26.53097500000149 | 1 |
| 26.55140999983996 | 1 |
| 26.57184399990365 | 1 |
| 26.592279000207782 | 1 |
| 26.612712999805808 | 1 |
| 26.633146999869496 | 1 |
| 26.65358200017363 | 1 |
| 26.674015999771655 | 1 |
| 26.694451000075787 | 1 |
| 26.714885000139475 | 1 |
| 26.735319999977946 | 1 |
| 26.755754000041634 | 1 |
| 26.77618800010532 | 1 |
| 26.796622999943793 | 1 |
| 26.81705700000748 | 1 |
| 26.837491999845952 | 1 |
| 26.85792599990964 | 1 |
| 26.878361000213772 | 1 |
| 26.8987949998118 | 1 |
| 26.91923000011593 | 1 |
| 26.93966400017962 | 1 |
| 26.960097999777645 | 1 |
| 26.980533000081778 | 1 |
| 27.000967000145465 | 1 |
| 27.021401999983937 | 1 |
| 27.041836000047624 | 1 |
| 27.062270999886096 | 1 |
| 27.082704999949783 | 1 |
| 27.10313900001347 | 1 |
| 27.123573999851942 | 1 |
| 27.14400799991563 | 1 |
| 27.164443000219762 | 1 |
| 27.18487699981779 | 1 |
| 27.20531200012192 | 1 |
| 27.22574600018561 | 1 |
| 27.24618100002408 | 1 |
| 27.266615000087768 | 1 |
| 27.287049000151455 | 1 |
| 27.307483999989927 | 1 |
| 27.327918000053614 | 1 |
| 27.348352999892086 | 1 |
| 27.368786999955773 | 1 |
| 27.389221999794245 | 1 |
| 27.409655999857932 | 1 |
| 27.43008999992162 | 1 |
| 27.450525000225753 | 1 |
| 27.47095899982378 | 1 |
| 27.49139400012791 | 1 |
| 27.5118280001916 | 1 |
| 27.53226300003007 | 1 |
| 27.552697000093758 | 1 |
| 27.573131000157446 | 1 |
| 27.593565999995917 | 1 |
| 27.614000000059605 | 1 |
| 27.634434999898076 | 1 |
| 27.654868999961764 | 1 |
| 27.675303999800235 | 1 |
| 27.695737999863923 | 1 |
| 27.71617199992761 | 1 |
| 27.736607000231743 | 1 |
| 27.75704099982977 | 1 |
| 27.777476000133902 | 1 |
| 27.79791000019759 | 1 |
| 27.81834500003606 | 1 |
| 27.83877900009975 | 1 |
| 27.859213000163436 | 1 |
| 27.879648000001907 | 1 |
| 27.900082000065595 | 1 |
| 27.920516999904066 | 1 |
| 27.940950999967754 | 1 |
| 27.961385999806225 | 1 |
| 27.981819999869913 | 1 |
| 28.002255000174046 | 1 |
| 28.022688999772072 | 1 |
| 28.043124000076205 | 1 |
| 28.063558000139892 | 1 |
| 28.08399200020358 | 1 |
| 28.10442700004205 | 1 |
| 28.12486100010574 | 1 |
| 28.14529599994421 | 1 |
| 28.165730000007898 | 1 |
| 28.186164000071585 | 1 |
| 28.206598999910057 | 1 |
| 28.227032999973744 | 1 |
| 28.247467999812216 | 1 |
| 28.267901999875903 | 1 |
| 28.288337000180036 | 1 |
| 28.308770999778062 | 1 |
| 28.329206000082195 | 1 |
| 28.349640000145882 | 1 |
| 28.37007400020957 | 1 |
| 28.39050900004804 | 1 |
| 28.41094300011173 | 1 |
| 28.4313779999502 | 1 |
| 28.451812000013888 | 1 |
| 28.47224699985236 | 1 |
| 28.492680999916047 | 1 |
| 28.513114999979734 | 1 |
| 28.533549999818206 | 1 |
| 28.553983999881893 | 1 |
| 28.574419000186026 | 1 |
| 28.594852999784052 | 1 |
| 28.615288000088185 | 1 |
| 28.635722000151873 | 1 |
| 28.65615600021556 | 1 |
| 28.67659100005403 | 1 |
| 28.69702500011772 | 1 |
| 28.71745999995619 | 1 |
| 28.737894000019878 | 1 |
| 28.75832899985835 | 1 |
| 28.778762999922037 | 1 |
| 28.79919800022617 | 1 |
| 28.819631999824196 | 1 |
| 28.840065999887884 | 1 |
| 28.860501000192016 | 1 |
| 28.880934999790043 | 1 |
| 28.901370000094175 | 1 |
| 28.921804000157863 | 1 |
| 28.942238999996334 | 1 |
| 28.962673000060022 | 1 |
| 28.98310700012371 | 1 |
| 29.00354199996218 | 1 |
| 29.02397600002587 | 1 |
| 29.04441099986434 | 1 |
| 29.064844999928027 | 1 |
| 29.08528000023216 | 1 |
| 29.105713999830186 | 1 |
| 29.12614900013432 | 1 |
| 29.146583000198007 | 1 |
| 29.167016999796033 | 1 |
| 29.187452000100166 | 1 |
| 29.207886000163853 | 1 |
| 29.228321000002325 | 1 |
| 29.248755000066012 | 0.999 |
| 29.269189999904484 | 0.999 |
| 29.28962399996817 | 0.999 |
| 29.33049299987033 | 0.999 |
| 29.350926999934018 | 0.999 |
| 29.37136199977249 | 0.999 |
| 29.391795999836177 | 1 |
| 29.41223100014031 | 1 |
| 29.432665000203997 | 1 |
| 29.453098999802023 | 1 |
| 29.473534000106156 | 1 |
| 29.493968000169843 | 1 |
| 29.514403000008315 | 1 |
| 29.534837000072002 | 1 |
| 29.555271999910474 | 1 |
| 29.57570599997416 | 1 |
| 29.59614000003785 | 1 |
| 29.61657499987632 | 1 |
| 29.637008999940008 | 1 |
| 29.65744399977848 | 1 |
| 29.677877999842167 | 1 |
| 29.6983130001463 | 1 |
| 29.718747000209987 | 1 |
| 29.73918200004846 | 1 |
| 29.759616000112146 | 1 |
| 29.780050000175834 | 1 |
| 29.800485000014305 | 1 |
| 29.820919000077993 | 1 |
| 29.841353999916464 | 1 |
| 29.86178799998015 | 1 |
| 29.882222999818623 | 1 |
| 29.90265699988231 | 1 |
| 29.923090999945998 | 1 |
| 29.94352599978447 | 1 |
| 29.963959999848157 | 1 |
| 29.98439500015229 | 1 |
| 30.004829000215977 | 1 |
| 30.02526400005445 | 1 |
| 30.045698000118136 | 1 |
| 30.066132999956608 | 1 |
| 30.086567000020295 | 1 |
| 30.107001000083983 | 1 |
| 30.127435999922454 | 1 |
| 30.147869999986142 | 1 |
| 30.168304999824613 | 1 |
| 30.1887389998883 | 1 |
| 30.209174000192434 | 1 |
| 30.22960799979046 | 1 |
| 30.250041999854147 | 1 |
| 30.27047700015828 | 1 |
| 30.290911000221968 | 1 |
| 30.31134600006044 | 1 |
| 30.331780000124127 | 1 |
| 30.352214000187814 | 1 |
| 30.372649000026286 | 1 |
| 30.393083000089973 | 1 |
| 30.413517999928445 | 1 |
| 30.433951999992132 | 1 |
| 30.454386999830604 | 1 |
| 30.47482099989429 | 1 |
| 30.495256000198424 | 1 |
| 30.51568999979645 | 1 |
| 30.536125000100583 | 1 |
| 30.55655900016427 | 1 |
| 30.576993000227958 | 1 |
| 30.59742800006643 | 1 |
| 30.617862000130117 | 1 |
| 30.63829699996859 | 1 |
| 30.658731000032276 | 1 |
| 30.679165000095963 | 1 |
| 30.699599999934435 | 1 |
| 30.720033999998122 | 1 |
| 30.740468999836594 | 1 |
| 30.76090299990028 | 1 |
| 30.781338000204414 | 1 |
| 30.80177199980244 | 1 |
| 30.822207000106573 | 1 |
| 30.84264100017026 | 1 |
| 30.863076000008732 | 1 |
| 30.88351000007242 | 1 |
| 30.903944000136107 | 1 |
| 30.92437899997458 | 1 |
| 30.944813000038266 | 1 |
| 30.965247999876738 | 1 |
| 30.985681999940425 | 1 |
| 31.006116000004113 | 1 |
| 31.026550999842584 | 1 |
| 31.04698499990627 | 1 |
| 31.067420000210404 | 1 |
| 31.08785399980843 | 1 |
| 31.108289000112563 | 1 |
| 31.12872300017625 | 1 |
| 31.149156999774277 | 1 |
| 31.16959200007841 | 1 |
| 31.190026000142097 | 1 |
| 31.21046099998057 | 1 |
| 31.230895000044256 | 1 |
| 31.251329999882728 | 1 |
| 31.271763999946415 | 1 |
| 31.292198999784887 | 1 |
| 31.312632999848574 | 1 |
| 31.333066999912262 | 1 |
| 31.353502000216395 | 1 |
| 31.37393599981442 | 1 |
| 31.394371000118554 | 1 |
| 31.41480500018224 | 1 |
| 31.435240000020713 | 1 |
| 31.4556740000844 | 1 |
| 31.476108000148088 | 1 |
| 31.49654299998656 | 1 |
| 31.516977000050247 | 1 |
| 31.537411999888718 | 1 |
| 31.557845999952406 | 1 |
| 31.578280999790877 | 1 |
| 31.598714999854565 | 1 |
| 31.619150000158697 | 1 |
| 31.639584000222385 | 1 |
| 31.66001799982041 | 0.999 |
| 31.680453000124544 | 1 |
| 31.70088700018823 | 1 |
| 31.721322000026703 | 1 |
| 31.74175600009039 | 1 |
| 31.762190999928862 | 1 |
| 31.78262499999255 | 1 |
| 31.803059000056237 | 1 |
| 31.82349399989471 | 1 |
| 31.843927999958396 | 1 |
| 31.864362999796867 | 1 |
| 31.884796999860555 | 1 |
| 31.905232000164688 | 1 |
| 31.925666000228375 | 1 |
| 31.9460999998264 | 1 |
| 31.966535000130534 | 1 |
| 31.98696900019422 | 1 |
| 32.00740400003269 | 1 |
| 32.02783800009638 | 1 |
| 32.04827299993485 | 1 |
| 32.06870699999854 | 1 |
| 32.08914100006223 | 1 |
| 32.1095759999007 | 1 |
| 32.130009999964386 | 1 |
| 32.15044499980286 | 1 |
| 32.170878999866545 | 1 |
| 32.19131400017068 | 1 |
| 32.211747999768704 | 1 |
| 32.23218300007284 | 1 |
| 32.252617000136524 | 1 |
| 32.27305100020021 | 1 |
| 32.31392000010237 | 1 |
| 32.33435499994084 | 1 |
| 32.35478900000453 | 1 |
| 32.375223999843 | 1 |
| 32.39565799990669 | 1 |
| 32.41609199997038 | 1 |
| 32.43652699980885 | 1 |
| 32.456960999872535 | 1 |
| 32.47739600017667 | 0.999 |
| 32.497829999774694 | 0.999 |
| 32.51826500007883 | 0.999 |
| 32.538699000142515 | 0.999 |
| 32.559133999980986 | 0.999 |
| 32.579568000044674 | 0.999 |
| 32.60000200010836 | 0.999 |
| 32.62043699994683 | 1 |
| 32.66130599984899 | 1 |
| 32.68173999991268 | 1 |
| 32.70217500021681 | 1 |
| 32.72260899981484 | 1 |
| 32.743042999878526 | 1 |
| 32.76347800018266 | 1 |
| 32.783911999780685 | 1 |
| 32.80434700008482 | 1 |
| 32.824781000148505 | 1 |
| 32.845215999986976 | 1 |
| 32.865650000050664 | 1 |
| 32.88608400011435 | 1 |
| 32.90651899995282 | 1 |
| 32.92695300001651 | 1 |
| 32.94738799985498 | 1 |
| 32.96782199991867 | 1 |
| 32.9882570002228 | 1 |
| 33.00869099982083 | 1 |
| 33.029124999884516 | 1 |
| 33.04956000018865 | 1 |
| 33.069993999786675 | 1 |
| 33.09042900009081 | 1 |
| 33.110863000154495 | 1 |
| 33.13129799999297 | 1 |
| 33.151732000056654 | 1 |
| 33.17216600012034 | 1 |
| 33.19260099995881 | 1 |
| 33.2130350000225 | 1 |
| 33.23346999986097 | 1 |
| 33.25390399992466 | 1 |
| 33.27433900022879 | 1 |
| 33.29477299982682 | 1 |
| 33.31520800013095 | 1 |
| 33.33564200019464 | 1 |
| 33.356075999792665 | 1 |
| 33.3765110000968 | 1 |
| 33.396945000160486 | 1 |
| 33.41737999999896 | 1 |
| 33.437814000062644 | 1 |
| 33.458248999901116 | 1 |
| 33.4786829999648 | 1 |
| 33.499117999803275 | 1 |
| 33.51955199986696 | 1 |
| 33.53998599993065 | 1 |
| 33.56042099976912 | 1 |
| 33.58085499983281 | 1 |
| 33.60129000013694 | 1 |
| 33.62172400020063 | 1 |
| 33.6421590000391 | 1 |
| 33.66259300010279 | 1 |
| 33.683027000166476 | 1 |
| 33.70346200000495 | 1 |
| 33.723896000068635 | 1 |
| 33.744330999907106 | 1 |
| 33.764764999970794 | 1 |
| 33.785199999809265 | 1 |
| 33.80563399987295 | 1 |
| 33.82606799993664 | 1 |
| 33.84650299977511 | 1 |
| 33.8669369998388 | 1 |
| 33.88737200014293 | 1 |
| 33.90780600020662 | 1 |
| 33.92824100004509 | 1 |
| 33.94867500010878 | 1 |
| 33.969109000172466 | 1 |
| 33.98954400001094 | 1 |
| 34.009978000074625 | 1 |
| 34.030412999913096 | 1 |
| 34.050846999976784 | 1 |
| 34.071281999815255 | 1 |
| 34.09171599987894 | 1 |
| 34.112151000183076 | 1 |
| 34.1325849997811 | 1 |
| 34.15301899984479 | 1 |
| 34.17345400014892 | 1 |
| 34.19388800021261 | 1 |
| 34.21432300005108 | 1 |
| 34.23475700011477 | 1 |
| 34.25519199995324 | 1 |
| 34.27562600001693 | 1 |
| 34.296060000080615 | 1 |
| 34.31649499991909 | 1 |
| 34.336928999982774 | 1 |
| 34.357363999821246 | 1 |
| 34.37779799988493 | 1 |
| 34.398233000189066 | 1 |
| 34.41866699978709 | 1 |
| 34.439102000091225 | 1 |
| 34.45953600015491 | 1 |
| 34.4799700002186 | 1 |
| 34.50040500005707 | 1 |
| 34.52083900012076 | 1 |
| 34.54127399995923 | 1 |
| 34.56170800002292 | 1 |
| 34.58214299986139 | 1 |
| 34.60257699992508 | 1 |
| 34.623010999988765 | 1 |
| 34.66387999989092 | 1 |
| 34.684315000195056 | 1 |
| 34.70474899979308 | 1 |
| 34.725184000097215 | 1 |
| 34.7456180001609 | 1 |
| 34.76605200022459 | 1 |
| 34.78648700006306 | 1 |
| 34.80692100012675 | 1 |
| 34.82735599996522 | 1 |
| 34.84779000002891 | 1 |
| 34.86822499986738 | 1 |
| 34.88865899993107 | 1 |
| 34.90909399976954 | 1 |
| 34.929527999833226 | 1 |
| 34.949961999896914 | 1 |
| 34.97039700020105 | 1 |
| 34.99083099979907 | 1 |
| 35.011266000103205 | 1 |
| 35.03170000016689 | 1 |
| 35.052135000005364 | 1 |
| 35.07256900006905 | 1 |
| 35.09300300013274 | 1 |
| 35.11343799997121 | 1 |
| 35.1338720000349 | 1 |
| 35.15430699987337 | 1 |
| 35.17474099993706 | 1 |
| 35.19517599977553 | 1 |
| 35.21560999983922 | 1 |
| 35.236043999902904 | 1 |
| 35.25647900020704 | 1 |
| 35.297348000109196 | 1 |
| 35.31778200017288 | 1 |
| 35.338217000011355 | 1 |
| 35.35865100007504 | 1 |
| 35.37908500013873 | 1 |
| 35.3995199999772 | 1 |
| 35.41995400004089 | 1 |
| 35.44038899987936 | 1 |
| 35.46082299994305 | 1 |
| 35.48125799978152 | 1 |
| 35.50169199984521 | 1 |
| 35.522125999908894 | 1 |
| 35.54256100021303 | 1 |
| 35.56299499981105 | 1 |
| 35.583430000115186 | 1 |
| 35.60386400017887 | 1 |
| 35.624299000017345 | 1 |
| 35.64473300008103 | 1 |
| 35.665167999919504 | 1 |
| 35.68560199998319 | 0.999 |
| 35.70603600004688 | 1 |
| 35.72647099988535 | 0.999 |
| 35.74690499994904 | 0.999 |
| 35.76733999978751 | 0.999 |
| 35.7877739998512 | 0.999 |
| 35.80820900015533 | 0.999 |
| 35.82864300021902 | 1 |
| 35.84907699981704 | 1 |
| 35.869512000121176 | 1 |
| 35.889946000184864 | 1 |
| 35.910381000023335 | 1 |
| 35.93081500008702 | 1 |
| 35.951249999925494 | 1 |
| 35.97168399998918 | 1 |
| 35.99211899982765 | 1 |
| 36.01255299989134 | 1 |
| 36.03298699995503 | 1 |
| 36.0534219997935 | 1 |
| 36.07385599985719 | 1 |
| 36.09429100016132 | 1 |
| 36.11472500022501 | 1 |
| 36.13516000006348 | 1 |
| 36.15559400012717 | 1 |
| 36.176028000190854 | 1 |
| 36.196463000029325 | 1 |
| 36.21689700009301 | 1 |
| 36.237331999931484 | 1 |
| 36.25776599999517 | 1 |
| 36.27820099983364 | 1 |
| 36.29863499989733 | 1 |
| 36.31906899996102 | 1 |
| 36.33950399979949 | 1 |
| 36.35993799986318 | 1 |
| 36.38037300016731 | 1 |
| 36.400807000231 | 1 |
| 36.42124200006947 | 1 |
| 36.44167600013316 | 1 |
| 36.462110000196844 | 1 |
| 36.482545000035316 | 1 |
| 36.502979000099 | 1 |
| 36.523413999937475 | 1 |
| 36.54384800000116 | 1 |
| 36.564282999839634 | 1 |
| 36.58471699990332 | 1 |
| 36.605152000207454 | 1 |
| 36.62558599980548 | 1 |
| 36.64601999986917 | 1 |
| 36.6664550001733 | 1 |
| 36.68688899977133 | 1 |
| 36.70732400007546 | 1 |
| 36.72775800013915 | 1 |
| 36.74819299997762 | 1 |
| 36.768627000041306 | 1 |
| 36.789061000104994 | 1 |
| 36.809495999943465 | 1 |
| 36.82993000000715 | 1 |
| 36.850364999845624 | 1 |
| 36.87079899990931 | 1 |
| 36.891234000213444 | 1 |
| 36.91166799981147 | 1 |
| 36.9321030001156 | 1 |
| 36.95253700017929 | 1 |
| 36.97297099977732 | 1 |
| 36.99340600008145 | 1 |
| 37.01384000014514 | 1 |
| 37.03427499998361 | 1 |
| 37.054709000047296 | 1 |
| 37.07514399988577 | 1 |
| 37.095577999949455 | 1 |
| 37.11601200001314 | 1 |
| 37.136446999851614 | 1 |
| 37.1568809999153 | 1 |
| 37.177316000219434 | 1 |
| 37.19774999981746 | 1 |
| 37.21818500012159 | 1 |
| 37.23861900018528 | 1 |
| 37.25905299978331 | 1 |
| 37.27948800008744 | 1 |
| 37.29992200015113 | 1 |
| 37.3203569999896 | 1 |
| 37.34079100005329 | 1 |
| 37.36122599989176 | 1 |
| 37.381659999955446 | 1 |
| 37.40209499979392 | 1 |
| 37.422528999857605 | 1 |
| 37.44296299992129 | 1 |
| 37.463398000225425 | 1 |
| 37.48383199982345 | 1 |
| 37.504267000127584 | 1 |
| 37.52470100019127 | 1 |
| 37.5451349997893 | 1 |
| 37.56557000009343 | 1 |
| 37.58600400015712 | 1 |
| 37.60643899999559 | 1 |
| 37.62687300005928 | 1 |
| 37.64730799989775 | 1 |
| 37.667741999961436 | 1 |
| 37.68817699979991 | 1 |
| 37.708610999863595 | 1 |
| 37.72904600016773 | 1 |
| 37.749480000231415 | 1 |
| 37.76991399982944 | 1 |
| 37.790349000133574 | 1 |
| 37.81078300019726 | 1 |
| 37.83121800003573 | 1 |
| 37.85165200009942 | 1 |
| 37.87208600016311 | 1 |
| 37.89252100000158 | 1 |
| 37.91295500006527 | 1 |
| 37.93338999990374 | 1 |
| 37.953823999967426 | 1 |
| 37.9742589998059 | 1 |
| 37.994692999869585 | 1 |
| 38.01512800017372 | 1 |
| 38.035561999771744 | 1 |
| 38.05599599983543 | 1 |
| 38.076431000139564 | 1 |
| 38.09686500020325 | 1 |
| 38.11730000004172 | 1 |
| 38.13773400010541 | 1 |
| 38.15816899994388 | 1 |
| 38.17860300000757 | 1 |
| 38.19903700007126 | 1 |
| 38.21947199990973 | 1 |
| 38.239905999973416 | 1 |
| 38.280774999875575 | 1 |
| 38.30121000017971 | 1 |
| 38.321643999777734 | 1 |
| 38.34207799984142 | 1 |
| 38.362513000145555 | 1 |
| 38.38294700020924 | 1 |
| 38.40338200004771 | 1 |
| 38.4238160001114 | 1 |
| 38.44425099994987 | 1 |
| 38.46468500001356 | 1 |
| 38.48511999985203 | 1 |
| 38.50555399991572 | 1 |
| 38.52598799997941 | 1 |
| 38.54642299981788 | 1 |
| 38.566856999881566 | 1 |
| 38.5872920001857 | 1 |
| 38.607725999783725 | 1 |
| 38.62816100008786 | 1 |
| 38.648595000151545 | 1 |
| 38.669029999990016 | 1 |
| 38.689464000053704 | 1 |
| 38.70989800011739 | 1 |
| 38.73033299995586 | 1 |
| 38.75076700001955 | 1 |
| 38.77120199985802 | 1 |
| 38.79163599992171 | 1 |
| 38.81207100022584 | 1 |
| 38.83250499982387 | 1 |
| 38.852938999887556 | 1 |
| 38.87337400019169 | 1 |
| 38.893807999789715 | 1 |
| 38.91424300009385 | 0.999 |
| 38.934677000157535 | 0.999 |
| 38.95511199999601 | 0.999 |
| 38.975546000059694 | 0.999 |
| 38.99598000012338 | 0.999 |
| 39.01641499996185 | 1 |
| 39.03684900002554 | 1 |
| 39.05728399986401 | 1 |
| 39.0777179999277 | 1 |
| 39.09815300023183 | 1 |
| 39.11858699982986 | 1 |
| 39.139020999893546 | 1 |
| 39.15945600019768 | 1 |
| 39.179889999795705 | 1 |
| 39.20032500009984 | 1 |
| 39.220759000163525 | 1 |
| 39.241194000002 | 1 |
| 39.261628000065684 | 1 |
| 39.28206200012937 | 1 |
| 39.30249699996784 | 1 |
| 39.32293100003153 | 1 |
| 39.34336599987 | 1 |
| 39.36379999993369 | 1 |
| 39.38423499977216 | 1 |
| 39.40466899983585 | 1 |
| 39.42510400013998 | 1 |
| 39.44553800020367 | 1 |
| 39.465971999801695 | 1 |
| 39.48640700010583 | 1 |
| 39.506841000169516 | 1 |
| 39.52727600000799 | 1 |
| 39.547710000071675 | 1 |
| 39.568144999910146 | 1 |
| 39.588578999973834 | 1 |
| 39.60901300003752 | 1 |
| 39.62944799987599 | 1 |
| 39.64988199993968 | 1 |
| 39.67031699977815 | 1 |
| 39.69075099984184 | 1 |
| 39.71118600014597 | 1 |
| 39.73162000020966 | 1 |
| 39.752053999807686 | 1 |
| 39.77248900011182 | 1 |
| 39.792923000175506 | 1 |
| 39.81335800001398 | 1 |
| 39.833792000077665 | 1 |
| 39.854226999916136 | 1 |
| 39.874660999979824 | 1 |
| 39.89509500004351 | 1 |
| 39.91552999988198 | 1 |
| 39.93596399994567 | 1 |
| 39.95639899978414 | 1 |
| 39.97683299984783 | 1 |
| 39.99726800015196 | 1 |
| 40.01770200021565 | 1 |
| 40.03813700005412 | 1 |
| 40.05857100011781 | 1 |
| 40.079005000181496 | 1 |
| 40.09944000001997 | 1 |
| 40.119874000083655 | 1 |
| 40.14030899992213 | 1 |
| 40.160742999985814 | 1 |
| 40.181177999824286 | 1 |
| 40.20161199988797 | 1 |
| 40.222047000192106 | 1 |
| 40.24248099979013 | 1 |
| 40.26291499985382 | 1 |
| 40.28335000015795 | 1 |
| 40.30378400022164 | 1 |
| 40.32421900006011 | 1 |
| 40.3446530001238 | 1 |
| 40.36508799996227 | 1 |
| 40.38552200002596 | 1 |
| 40.405956000089645 | 1 |
| 40.42639099992812 | 1 |
| 40.446824999991804 | 1 |
| 40.467259999830276 | 1 |
| 40.48769399989396 | 1 |
| 40.508129000198096 | 1 |
| 40.52856299979612 | 1 |
| 40.54899699985981 | 1 |
| 40.56943200016394 | 1 |
| 40.58986600022763 | 1.001 |
| 40.6103010000661 | 1 |
| 40.63073500012979 | 1 |
| 40.65116999996826 | 1 |
| 40.67160400003195 | 1 |
| 40.692038000095636 | 1 |
| 40.71247299993411 | 1 |
| 40.732906999997795 | 1 |
| 40.753341999836266 | 1 |
| 40.773775999899954 | 1 |
| 40.794211000204086 | 1 |
| 40.81464499980211 | 1 |
| 40.8350789998658 | 1 |
| 40.85551400016993 | 1 |
| 40.87594799976796 | 1 |
| 40.89638300007209 | 1 |
| 40.91681700013578 | 1 |
| 40.93725199997425 | 1 |
| 40.95768600003794 | 1 |
| 40.97812099987641 | 1 |
| 40.9985549999401 | 1 |
| 41.018989000003785 | 1 |
| 41.039423999842256 | 1 |
| 41.059857999905944 | 1 |
| 41.08029300021008 | 1 |
| 41.1007269998081 | 1 |
| 41.121162000112236 | 1 |
| 41.14159600017592 | 1 |
| 41.16202999977395 | 1 |
| 41.18246500007808 | 1 |
| 41.20289900014177 | 1 |
| 41.22333399998024 | 1 |
| 41.2642029998824 | 1 |
| 41.28463699994609 | 1 |
| 41.30507199978456 | 1 |
| 41.32550599984825 | 1 |
| 41.345939999911934 | 1 |
| 41.36637500021607 | 1 |
| 41.38680899981409 | 1 |
| 41.407244000118226 | 1 |
| 41.42767800018191 | 1 |
| 41.448113000020385 | 1 |
| 41.46854700008407 | 1 |
| 41.48898100014776 | 1 |
| 41.50941599998623 | 1 |
| 41.52985000004992 | 1 |
| 41.55028499988839 | 1 |
| 41.57071899995208 | 1 |
| 41.59115399979055 | 1 |
| 41.61158799985424 | 1 |
| 41.632021999917924 | 1 |
| 41.65245700022206 | 1 |
| 41.67289099982008 | 1 |
| 41.693326000124216 | 1 |
| 41.713760000187904 | 1 |
| 41.734195000026375 | 1 |
| 41.75462900009006 | 1 |
| 41.775063999928534 | 1 |
| 41.79549799999222 | 1 |
| 41.81593200005591 | 1 |
| 41.83636699989438 | 1 |
| 41.85680099995807 | 1 |
| 41.87723599979654 | 1 |
| 41.89766999986023 | 1 |
| 41.91810500016436 | 1 |
| 41.93853900022805 | 1 |
| 41.958972999826074 | 1 |
| 41.979408000130206 | 1 |
| 41.999842000193894 | 1 |
| 42.020277000032365 | 1 |
| 42.04071100009605 | 1 |
| 42.061145999934524 | 1 |
| 42.08157999999821 | 1 |
| 42.10201499983668 | 1 |
| 42.12244899990037 | 0.999 |
| 42.14288299996406 | 0.999 |
| 42.16331799980253 | 0.999 |
| 42.18375199986622 | 0.999 |
| 42.20418700017035 | 0.999 |
| 42.224620999768376 | 0.999 |
| 42.24505600007251 | 1 |
| 42.2654900001362 | 1 |
| 42.285924000199884 | 1 |
| 42.306359000038356 | 1 |
| 42.32679300010204 | 1 |
| 42.347227999940515 | 1 |
| 42.3676620000042 | 1 |
| 42.38809699984267 | 1 |
| 42.40853099990636 | 1 |
| 42.42896499997005 | 1 |
| 42.44939999980852 | 1 |
| 42.46983399987221 | 1 |
| 42.49026900017634 | 1 |
| 42.51070299977437 | 1 |
| 42.531136999838054 | 1 |
| 42.55157099990174 | 1 |
| 42.572006000205874 | 1 |
| 42.5924399998039 | 1 |
| 42.61287500010803 | 1 |
| 42.63330900017172 | 1 |
| 42.65374400001019 | 1 |
| 42.67417800007388 | 1 |
| 42.69461299991235 | 1 |
| 42.71504699997604 | 1 |
| 42.73548100003973 | 1 |
| 42.7559159998782 | 1 |
| 42.776349999941885 | 1 |
| 42.79678499978036 | 1 |
| 42.817218999844044 | 1 |
| 42.83765400014818 | 1 |
| 42.858088000211865 | 1 |
| 42.87852199980989 | 1 |
| 42.898957000114024 | 1 |
| 42.91939100017771 | 1 |
| 42.93982600001618 | 1 |
| 42.96026000007987 | 1 |
| 42.98069499991834 | 1 |
| 43.00112899998203 | 1 |
| 43.02156300004572 | 1 |
| 43.04199799988419 | 1 |
| 43.062431999947876 | 1 |
| 43.08286699978635 | 1 |
| 43.103300999850035 | 1 |
| 43.12373600015417 | 1 |
| 43.144170000217855 | 1 |
| 43.16460399981588 | 1 |
| 43.185039000120014 | 1 |
| 43.2054730001837 | 1 |
| 43.22590800002217 | 1 |
| 43.24634200008586 | 1 |
| 43.26677699992433 | 1 |
| 43.28721099998802 | 1 |
| 43.30764599982649 | 1 |
| 43.32807999989018 | 1 |
| 43.348513999953866 | 1 |
| 43.36894899979234 | 1 |
| 43.389382999856025 | 1 |
| 43.40981800016016 | 1 |
| 43.430252000223845 | 1 |
| 43.45068599982187 | 1 |
| 43.471121000126004 | 1 |
| 43.49155500018969 | 1 |
| 43.51199000002816 | 1 |
| 43.53242400009185 | 1 |
| 43.55285899993032 | 1 |
| 43.57329299999401 | 1 |
| 43.59372799983248 | 1 |
| 43.61416199989617 | 1 |
| 43.6345970002003 | 1 |
| 43.65503099979833 | 1 |
| 43.675464999862015 | 1 |
| 43.69590000016615 | 1 |
| 43.716334000229836 | 1 |
| 43.73676900006831 | 1 |
| 43.757203000131994 | 1 |
| 43.777637999970466 | 1 |
| 43.79807200003415 | 1 |
| 43.81850600009784 | 1 |
| 43.83894099993631 | 1 |
| 43.859375 | 1 |
| 43.87980999983847 | 1 |
| 43.90024399990216 | 1 |
| 43.92067900020629 | 1 |
| 43.94111299980432 | 1 |
| 43.961546999868006 | 1 |
| 43.98198200017214 | 1 |
| 44.002415999770164 | 1 |
| 44.0228510000743 | 1 |
| 44.043285000137985 | 1 |
| 44.063719999976456 | 1 |
| 44.084154000040144 | 1 |
| 44.104588999878615 | 1 |
| 44.1250229999423 | 1 |
| 44.14545700000599 | 1 |
| 44.16589199984446 | 1 |
| 44.18632599990815 | 1 |
| 44.20676100021228 | 1 |
| 44.247628999873996 | 1 |
| 44.26806400017813 | 1 |
| 44.288497999776155 | 1 |
| 44.30893300008029 | 1 |
| 44.329367000143975 | 1 |
| 44.349801999982446 | 1 |
| 44.370236000046134 | 1 |
| 44.390670999884605 | 1 |
| 44.41110499994829 | 1 |
| 44.43153900001198 | 1 |
| 44.45197399985045 | 1 |
| 44.47240799991414 | 1 |
| 44.49284300021827 | 1 |
| 44.5132769998163 | 1 |
| 44.53371200012043 | 1 |
| 44.55414600018412 | 1 |
| 44.574579999782145 | 1 |
| 44.59501500008628 | 1 |
| 44.615449000149965 | 1 |
| 44.63588399998844 | 1 |
| 44.656318000052124 | 1 |
| 44.676752999890596 | 1 |
| 44.69718699995428 | 1 |
| 44.717621999792755 | 1 |
| 44.73805599985644 | 1 |
| 44.75848999992013 | 1 |
| 44.77892500022426 | 1 |
| 44.79935899982229 | 1 |
| 44.81979400012642 | 1 |
| 44.84022800019011 | 1 |
| 44.86066300002858 | 1 |
| 44.88109700009227 | 1 |
| 44.901531000155956 | 1 |
| 44.92196599999443 | 1 |
| 44.942400000058115 | 1 |
| 44.962834999896586 | 1 |
| 44.98326899996027 | 1 |